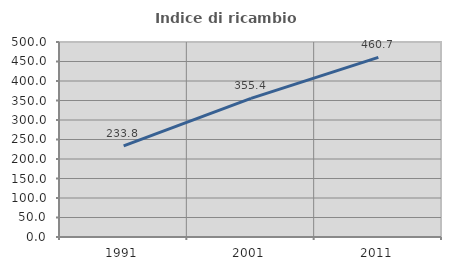
| Category | Indice di ricambio occupazionale  |
|---|---|
| 1991.0 | 233.784 |
| 2001.0 | 355.357 |
| 2011.0 | 460.714 |